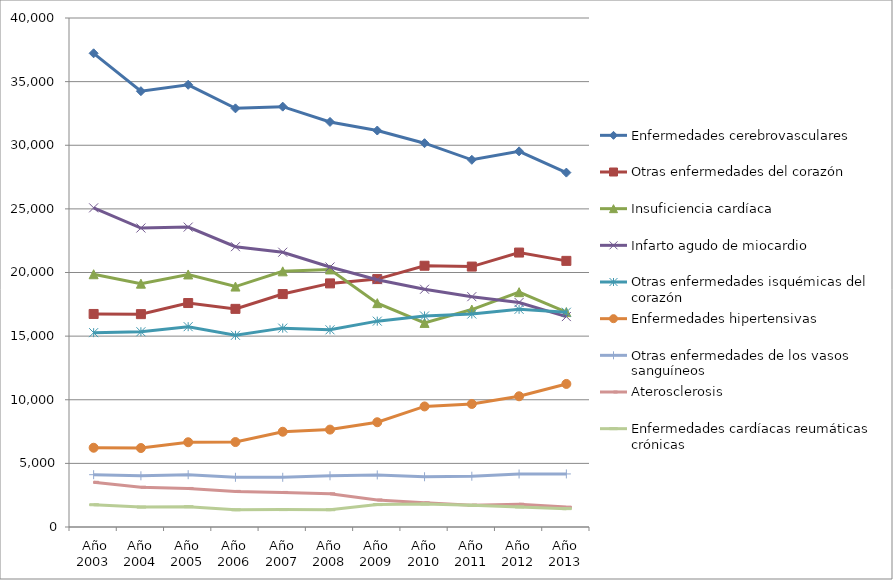
| Category | Enfermedades cerebrovasculares | Otras enfermedades del corazón | Insuficiencia cardíaca | Infarto agudo de miocardio | Otras enfermedades isquémicas del corazón | Enfermedades hipertensivas | Otras enfermedades de los vasos sanguíneos | Aterosclerosis | Enfermedades cardíacas reumáticas crónicas |
|---|---|---|---|---|---|---|---|---|---|
|  Año 2003 | 37225 | 16742 | 19863 | 25080 | 15273 | 6228 | 4110 | 3513 | 1749 |
| Año 2004 | 34250 | 16728 | 19123 | 23496 | 15344 | 6206 | 4024 | 3130 | 1566 |
| Año 2005 | 34750 | 17600 | 19846 | 23569 | 15744 | 6661 | 4112 | 3029 | 1596 |
| Año 2006 | 32900 | 17142 | 18895 | 22028 | 15064 | 6676 | 3906 | 2798 | 1351 |
| Año 2007 | 33034 | 18305 | 20092 | 21594 | 15628 | 7486 | 3906 | 2715 | 1366 |
| Año 2008 | 31833 | 19143 | 20241 | 20433 | 15495 | 7654 | 4026 | 2609 | 1359 |
| Año 2009 | 31157 | 19483 | 17592 | 19437 | 16177 | 8233 | 4093 | 2126 | 1759 |
| Año 2010 | 30161 | 20531 | 16038 | 18684 | 16584 | 9474 | 3948 | 1897 | 1811 |
| Año 2011 | 28855 | 20466 | 17089 | 18101 | 16736 | 9669 | 3990 | 1717 | 1704 |
| Año 2012 | 29520 | 21567 | 18453 | 17644 | 17107 | 10273 | 4166 | 1790 | 1577 |
| Año 2013 | 27850 | 20914 | 16888 | 16536 | 16877 | 11243 | 4170 | 1563 | 1443 |